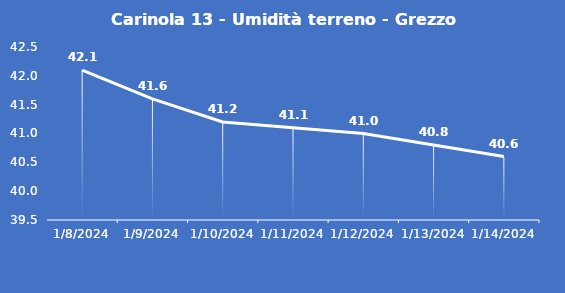
| Category | Carinola 13 - Umidità terreno - Grezzo (%VWC) |
|---|---|
| 1/8/24 | 42.1 |
| 1/9/24 | 41.6 |
| 1/10/24 | 41.2 |
| 1/11/24 | 41.1 |
| 1/12/24 | 41 |
| 1/13/24 | 40.8 |
| 1/14/24 | 40.6 |